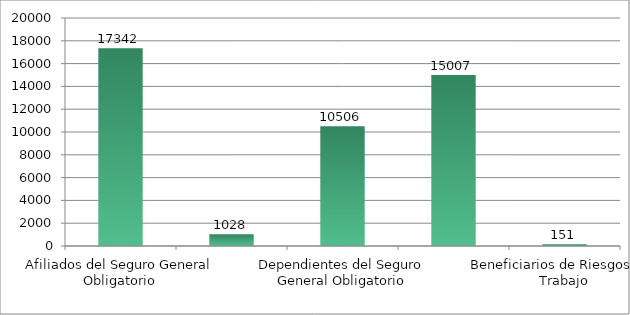
| Category | Series 0 |
|---|---|
| Afiliados del Seguro General Obligatorio | 17342 |
| Pensionistas del Seguro General Obligatorio | 1028 |
| Dependientes del Seguro General Obligatorio | 10506 |
| Cobertura del Seguro Social Campesino (Afiliados, Pensionistas y Dependientes) | 15007 |
| Beneficiarios de Riesgos del Trabajo | 151 |